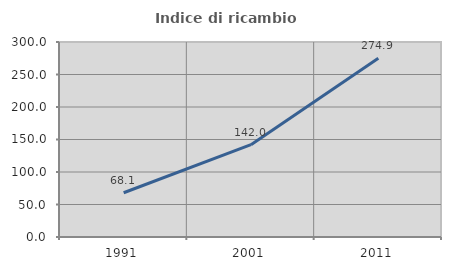
| Category | Indice di ricambio occupazionale  |
|---|---|
| 1991.0 | 68.102 |
| 2001.0 | 142.02 |
| 2011.0 | 274.908 |